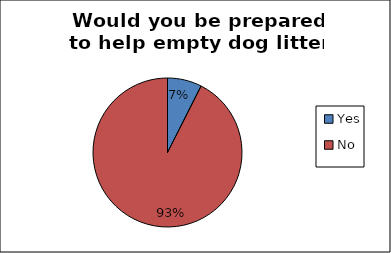
| Category | Series 0 |
|---|---|
| Yes | 0.074 |
| No | 0.926 |